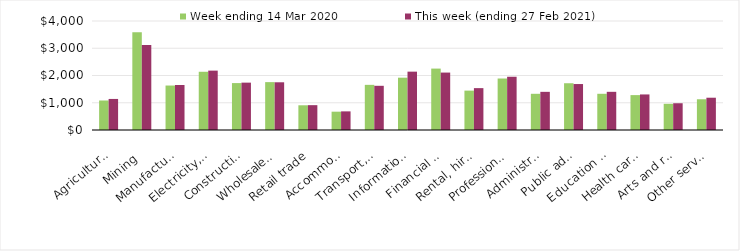
| Category | Week ending 14 Mar 2020 | This week (ending 27 Feb 2021) |
|---|---|---|
| Agriculture, forestry and fishing | 1082.9 | 1139.89 |
| Mining | 3586.53 | 3121.42 |
| Manufacturing | 1631.96 | 1651.97 |
| Electricity, gas, water and waste services | 2136.86 | 2178.86 |
| Construction | 1721.82 | 1737.99 |
| Wholesale trade | 1757.06 | 1751.06 |
| Retail trade | 907.19 | 911.6 |
| Accommodation and food services | 672.34 | 683.62 |
| Transport, postal and warehousing | 1656.74 | 1622.01 |
| Information media and telecommunications | 1919.77 | 2141.25 |
| Financial and insurance services | 2253.53 | 2107.57 |
| Rental, hiring and real estate services | 1445.2 | 1536.5 |
| Professional, scientific and technical services | 1889.61 | 1954.44 |
| Administrative and support services | 1328.56 | 1400.19 |
| Public administration and safety | 1716.11 | 1686.7 |
| Education and training | 1329.15 | 1401.03 |
| Health care and social assistance | 1280.65 | 1304.95 |
| Arts and recreation services | 961.56 | 982.01 |
| Other services | 1128.07 | 1184.56 |